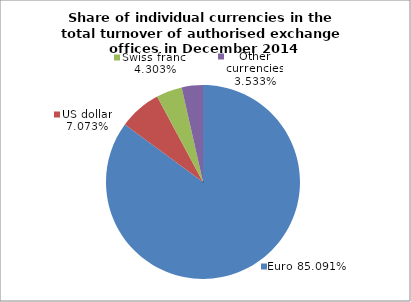
| Category | EUR |
|---|---|
| 0 | 0.851 |
| 1 | 0.071 |
| 2 | 0.043 |
| 3 | 0.035 |